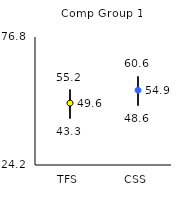
| Category | 25th | 75th | Mean |
|---|---|---|---|
| TFS | 43.3 | 55.2 | 49.63 |
| CSS | 48.6 | 60.6 | 54.91 |